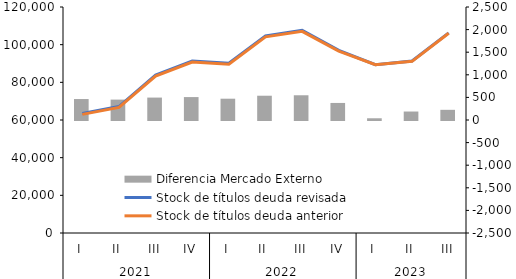
| Category | Diferencia Mercado Externo |
|---|---|
| 0 | 463.826 |
| 1 | 451.406 |
| 2 | 496.055 |
| 3 | 507.275 |
| 4 | 471.2 |
| 5 | 537.207 |
| 6 | 547.147 |
| 7 | 377.259 |
| 8 | 38.307 |
| 9 | 187.659 |
| 10 | 225.019 |